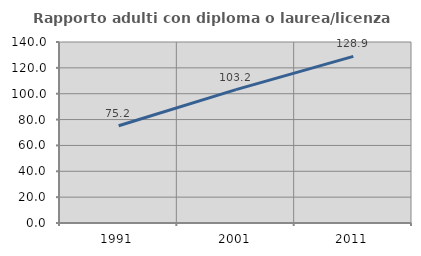
| Category | Rapporto adulti con diploma o laurea/licenza media  |
|---|---|
| 1991.0 | 75.179 |
| 2001.0 | 103.196 |
| 2011.0 | 128.913 |